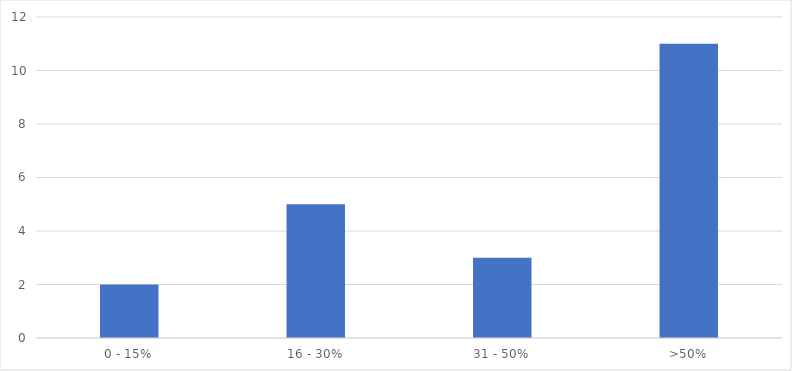
| Category | Number of Responses |
|---|---|
| 0 - 15% | 2 |
| 16 - 30% | 5 |
| 31 - 50% | 3 |
| >50% | 11 |